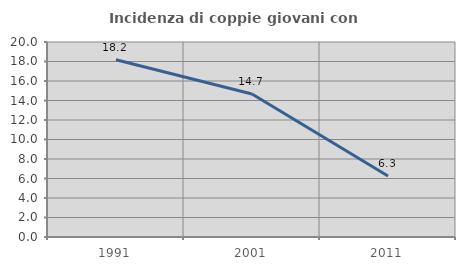
| Category | Incidenza di coppie giovani con figli |
|---|---|
| 1991.0 | 18.182 |
| 2001.0 | 14.663 |
| 2011.0 | 6.257 |